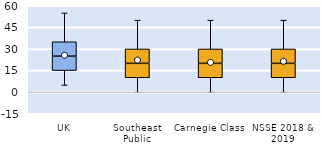
| Category | 25th | 50th | 75th |
|---|---|---|---|
| UK | 15 | 10 | 10 |
| Southeast Public | 10 | 10 | 10 |
| Carnegie Class | 10 | 10 | 10 |
| NSSE 2018 & 2019 | 10 | 10 | 10 |